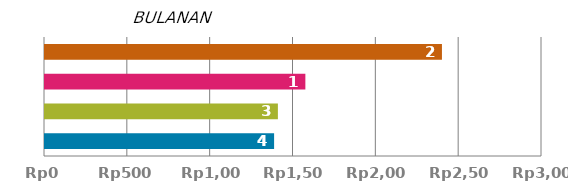
| Category | PEMBAYARAN |
|---|---|
| 0 | 1382.921 |
| 1 | 1405.775 |
| 2 | 1571.655 |
| 3 | 2396.046 |